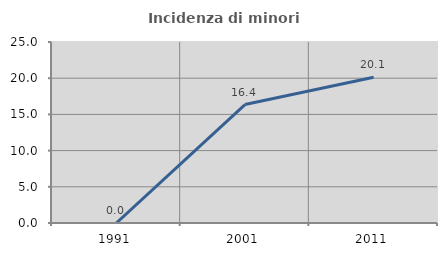
| Category | Incidenza di minori stranieri |
|---|---|
| 1991.0 | 0 |
| 2001.0 | 16.364 |
| 2011.0 | 20.128 |